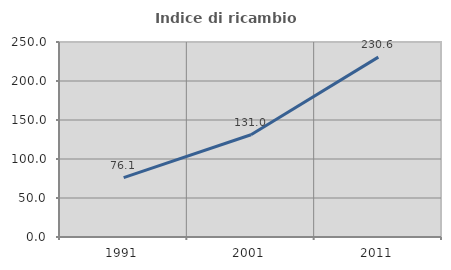
| Category | Indice di ricambio occupazionale  |
|---|---|
| 1991.0 | 76.145 |
| 2001.0 | 131.045 |
| 2011.0 | 230.627 |